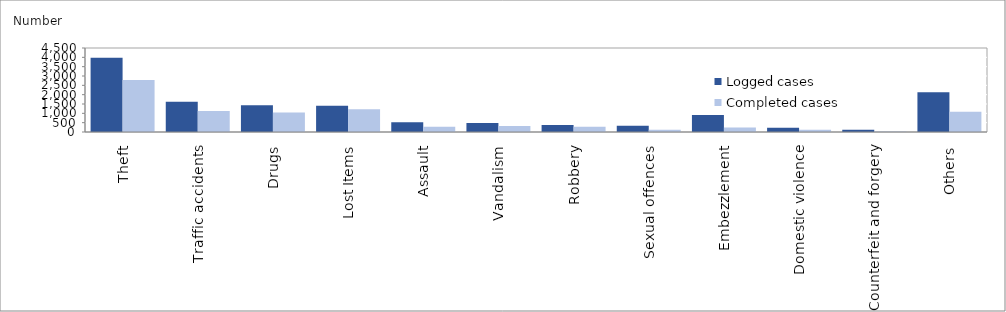
| Category | Logged cases |  Completed cases  |
|---|---|---|
| Theft | 3982 | 2790 |
| Traffic accidents | 1618 | 1125 |
| Drugs | 1429 | 1048 |
| Lost Items | 1412 | 1220 |
| Assault | 521 | 283 |
| Vandalism | 482 | 326 |
| Robbery | 372 | 275 |
| Sexual offences | 334 | 123 |
| Embezzlement | 914 | 247 |
| Domestic violence | 228 | 118 |
| Counterfeit and forgery | 116 | 27 |
| Others | 2135 | 1085 |